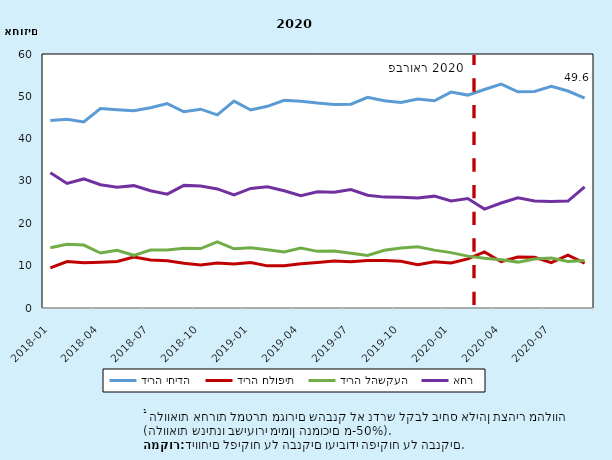
| Category | דירה יחידה | דירה חלופית | דירה להשקעה | אחר |
|---|---|---|---|---|
| 2018-01-31 | 44.304 | 9.5 | 14.226 | 31.969 |
| 2018-02-28 | 44.56 | 10.974 | 15.052 | 29.414 |
| 2018-03-31 | 43.934 | 10.718 | 14.859 | 30.489 |
| 2018-04-30 | 47.096 | 10.818 | 12.981 | 29.105 |
| 2018-05-31 | 46.848 | 10.987 | 13.642 | 28.523 |
| 2018-06-30 | 46.616 | 12.032 | 12.447 | 28.905 |
| 2018-07-31 | 47.289 | 11.339 | 13.684 | 27.688 |
| 2018-08-31 | 48.268 | 11.155 | 13.69 | 26.887 |
| 2018-09-30 | 46.352 | 10.589 | 14.094 | 28.966 |
| 2018-10-31 | 46.967 | 10.186 | 14.028 | 28.819 |
| 2018-11-30 | 45.622 | 10.615 | 15.63 | 28.133 |
| 2018-12-31 | 48.884 | 10.417 | 13.984 | 26.715 |
| 2019-01-31 | 46.772 | 10.767 | 14.218 | 28.243 |
| 2019-02-28 | 47.644 | 9.953 | 13.773 | 28.63 |
| 2019-03-31 | 49.065 | 9.973 | 13.259 | 27.704 |
| 2019-04-30 | 48.832 | 10.471 | 14.166 | 26.531 |
| 2019-05-31 | 48.414 | 10.755 | 13.381 | 27.45 |
| 2019-06-30 | 48.087 | 11.111 | 13.472 | 27.33 |
| 2019-07-31 | 48.145 | 10.941 | 12.918 | 27.996 |
| 2019-08-31 | 49.749 | 11.212 | 12.394 | 26.645 |
| 2019-09-30 | 48.952 | 11.215 | 13.641 | 26.192 |
| 2019-10-31 | 48.567 | 11.062 | 14.186 | 26.186 |
| 2019-11-30 | 49.356 | 10.207 | 14.458 | 25.979 |
| 2019-12-31 | 48.961 | 10.945 | 13.671 | 26.423 |
| 2020-01-31 | 51.001 | 10.646 | 13.086 | 25.267 |
| 2020-02-29 | 50.292 | 11.591 | 12.251 | 25.866 |
| 2020-03-31 | 51.622 | 13.235 | 11.771 | 23.372 |
| 2020-04-30 | 52.874 | 10.937 | 11.396 | 24.793 |
| 2020-05-31 | 51.056 | 12.055 | 10.841 | 26.049 |
| 2020-06-30 | 51.131 | 11.993 | 11.59 | 25.286 |
| 2020-07-31 | 52.368 | 10.713 | 11.789 | 25.13 |
| 2020-08-31 | 51.257 | 12.492 | 10.988 | 25.262 |
| 2020-09-30 | 49.554 | 10.609 | 11.224 | 28.613 |